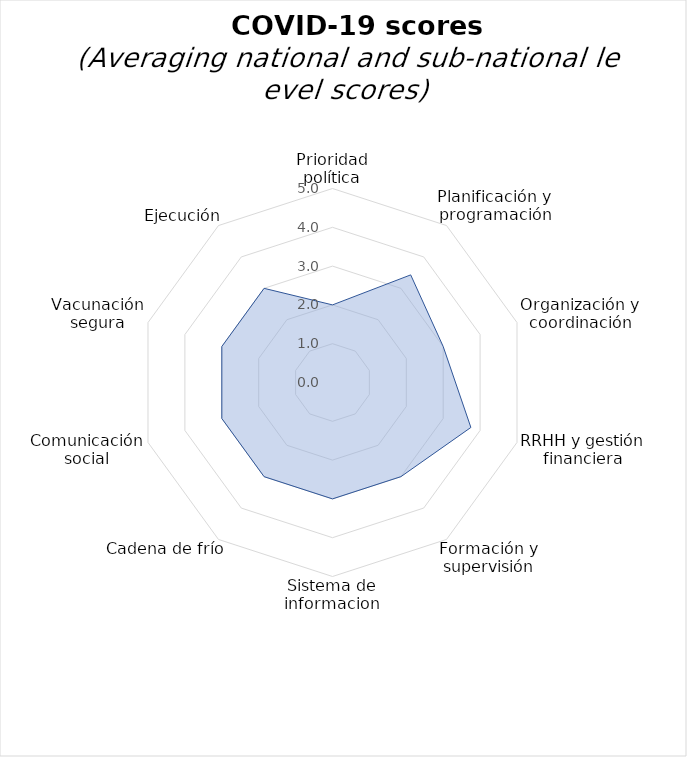
| Category | Puntajes promedio para preguntas sobre COVID-19 a partir de datos a nivel nacional y subnacional |
|---|---|
| Prioridad política | 2 |
| Planificación y programación | 3.429 |
| Organización y coordinación | 3 |
| RRHH y gestión financiera | 3.75 |
| Formación y supervisión | 3 |
| Sistema de informacion | 3 |
| Cadena de frío | 3 |
| Comunicación social | 3 |
| Vacunación segura | 3 |
|  Ejecución | 3 |